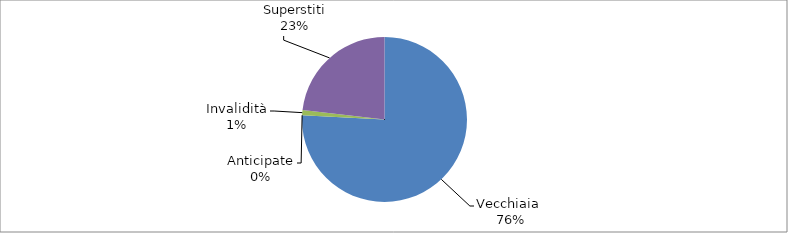
| Category | Series 0 |
|---|---|
| Vecchiaia  | 29264 |
| Anticipate | 0 |
| Invalidità | 382 |
| Superstiti | 8946 |